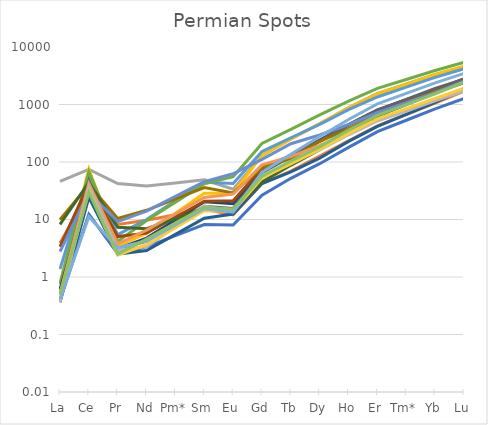
| Category | Series 0 | Series 1 | Series 2 | Series 3 | Series 4 | Series 5 | Series 6 | Series 7 | Series 8 | Series 9 | Series 10 | Series 11 | Series 12 | Series 13 | Series 14 | Series 15 | Series 16 | Series 17 |
|---|---|---|---|---|---|---|---|---|---|---|---|---|---|---|---|---|---|---|
| La | 0.398 | 3.899 | 45.881 | 0.772 | 1.376 | 0.753 | 0.614 | 3.352 | 0.498 | 9.932 | 0.363 | 8.194 | 2.766 | 0.507 | 0.365 | 0.475 | 0.415 | 0.498 |
| Ce | 12.309 | 29.523 | 74.354 | 75.762 | 58.851 | 67.512 | 32.696 | 42.22 | 46.762 | 40.001 | 24.361 | 44.185 | 29.289 | 42.547 | 36.922 | 31.034 | 11.183 | 30.074 |
| Pr | 2.564 | 8.213 | 42.235 | 3.462 | 5.459 | 4.163 | 3.099 | 5.039 | 2.997 | 10.424 | 2.505 | 7.347 | 9.194 | 3.777 | 2.977 | 2.395 | 3.225 | 2.495 |
| Nd | 3.349 | 9.686 | 38.352 | 5.715 | 9.995 | 9.59 | 4.74 | 5.786 | 4.212 | 14.447 | 2.877 | 6.894 | 14.007 | 6.531 | 3.343 | 3.648 | 4.228 | 4.586 |
| Pm* | 5.226 | 12.099 | 43.322 | 12.805 | 21.121 | 20.057 | 9.811 | 10.964 | 8.47 | 22.791 | 5.509 | 10.25 | 25.216 | 12.567 | 7.553 | 7.195 | 8.078 | 8.656 |
| Sm | 8.153 | 15.113 | 48.936 | 28.693 | 44.63 | 41.951 | 20.309 | 20.776 | 17.03 | 35.955 | 10.55 | 15.241 | 45.395 | 24.182 | 17.066 | 14.189 | 15.434 | 16.338 |
| Eu | 8.016 | 11.995 | 33.559 | 28.86 | 42.357 | 55.493 | 18.797 | 21.14 | 15.527 | 28.898 | 12.428 | 14.357 | 62.311 | 27.733 | 13.959 | 14.126 | 13.471 | 15.215 |
| Gd | 26.364 | 42.405 | 128.304 | 130.721 | 151.712 | 210.584 | 69.421 | 77.951 | 65.458 | 79.832 | 42.258 | 44.782 | 111.062 | 89.312 | 54.379 | 52.74 | 66.447 | 56.751 |
| Tb | 52.08 | 69.677 | 251.24 | 250.414 | 264.181 | 369.78 | 126.601 | 130.767 | 123.992 | 113.996 | 67.365 | 87.562 | 208.02 | 124.366 | 98.803 | 92.575 | 136.673 | 103.257 |
| Dy | 93.484 | 126.76 | 462.482 | 467.399 | 451.294 | 658.715 | 240.257 | 228.643 | 231.185 | 229.096 | 117.016 | 164.146 | 294.567 | 194.234 | 162.059 | 166.23 | 277.199 | 183.289 |
| Ho | 179.521 | 233.861 | 879.931 | 871.731 | 811.685 | 1141.097 | 446.747 | 437.189 | 436.711 | 376.621 | 228.438 | 331.977 | 448.64 | 325.712 | 297.388 | 315.308 | 548.748 | 358.012 |
| Er | 336.76 | 425.759 | 1554.365 | 1523.432 | 1352.681 | 1905.789 | 802.147 | 787.198 | 789.861 | 690.86 | 416.049 | 627.314 | 718.775 | 545.811 | 516.308 | 563.257 | 1025.607 | 644.732 |
| Tm* | 531.846 | 670.567 | 2271.351 | 2254.729 | 2002.112 | 2723.757 | 1210.936 | 1196.13 | 1227.412 | 1071.882 | 674.484 | 998.413 | 1077.031 | 819.521 | 771.687 | 847.298 | 1561.317 | 996.149 |
| Yb | 839.944 | 1056.138 | 3319.063 | 3337.074 | 2963.338 | 3892.797 | 1828.053 | 1817.493 | 1907.347 | 1663.043 | 1093.45 | 1589.042 | 1613.849 | 1230.491 | 1153.382 | 1274.574 | 2376.847 | 1539.109 |
| Lu | 1270.289 | 1694.413 | 4576.596 | 4638.216 | 4175.965 | 5409.439 | 2672.631 | 2803.346 | 2757.291 | 2397.894 | 1832.739 | 2414.074 | 2535.635 | 1889.306 | 1722.623 | 1913.303 | 3468.575 | 2451.04 |